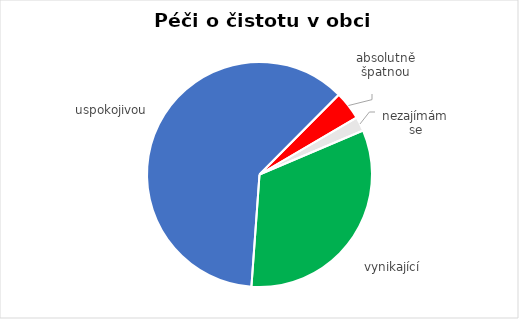
| Category | Series 0 |
|---|---|
| vynikající | 95 |
| uspokojivou | 179 |
| absolutně špatnou | 12 |
| nezajímám se | 6 |